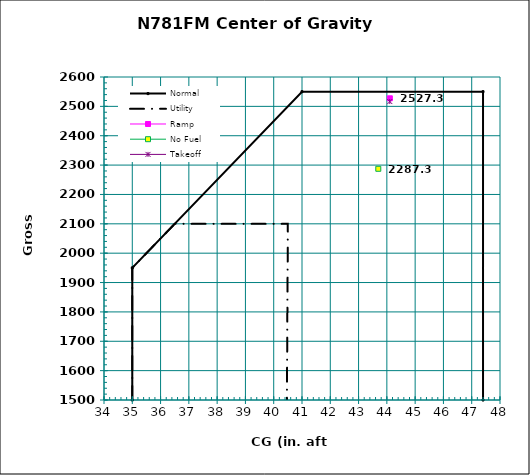
| Category | Normal |
|---|---|
| 35.0 | 1500 |
| 35.0 | 1950 |
| 41.0 | 2550 |
| 47.4 | 2550 |
| 47.4 | 1500 |